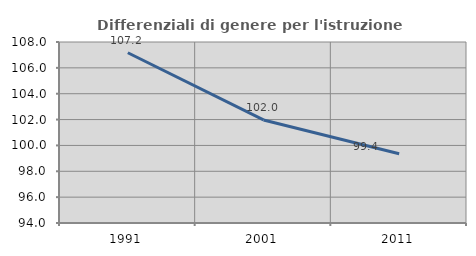
| Category | Differenziali di genere per l'istruzione superiore |
|---|---|
| 1991.0 | 107.168 |
| 2001.0 | 101.97 |
| 2011.0 | 99.362 |